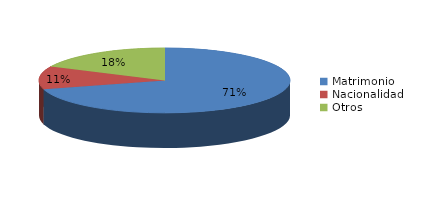
| Category | Series 0 |
|---|---|
| Matrimonio | 1986 |
| Nacionalidad | 321 |
| Otros | 506 |